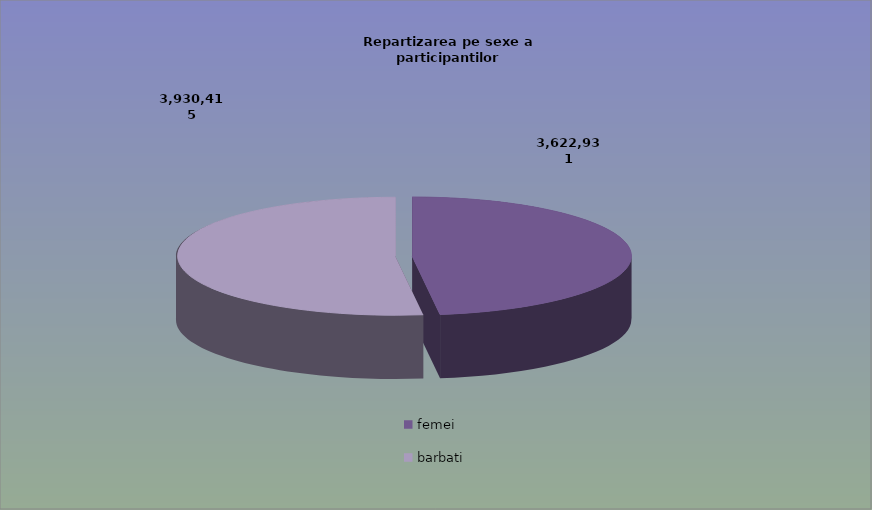
| Category | Series 0 |
|---|---|
| femei | 3622931 |
| barbati | 3930415 |